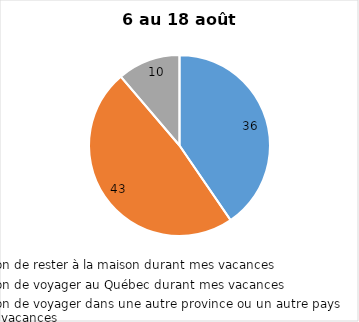
| Category | Series 0 |
|---|---|
| J’ai l’intention de rester à la maison durant mes vacances | 36 |
| J’ai l’intention de voyager au Québec durant mes vacances | 43 |
| J’ai l’intention de voyager dans une autre province ou un autre pays durant mes vacances | 10 |